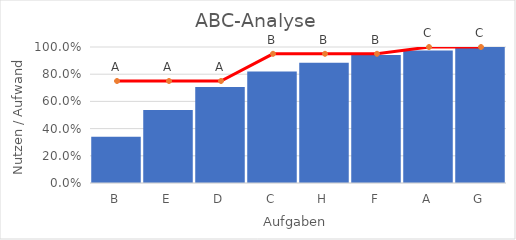
| Category | Series 0 |
|---|---|
| B | 0.339 |
| E | 0.537 |
| D | 0.707 |
| C | 0.82 |
| H | 0.884 |
| F | 0.941 |
| A | 0.975 |
| G | 1 |